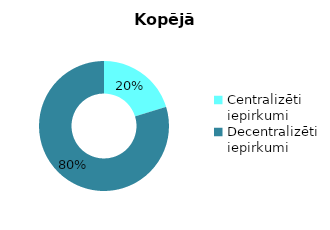
| Category | Series 0 |
|---|---|
| Centralizēti iepirkumi | 343256178 |
| Decentralizēti iepirkumi | 1352664539 |